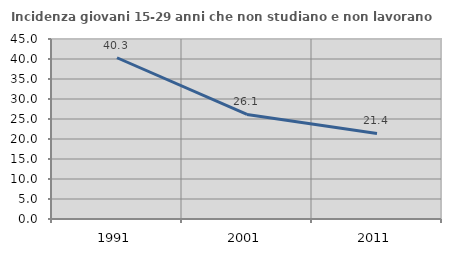
| Category | Incidenza giovani 15-29 anni che non studiano e non lavorano  |
|---|---|
| 1991.0 | 40.312 |
| 2001.0 | 26.128 |
| 2011.0 | 21.396 |